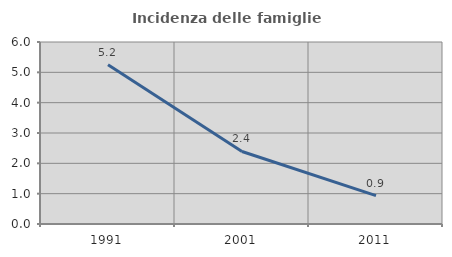
| Category | Incidenza delle famiglie numerose |
|---|---|
| 1991.0 | 5.25 |
| 2001.0 | 2.391 |
| 2011.0 | 0.933 |